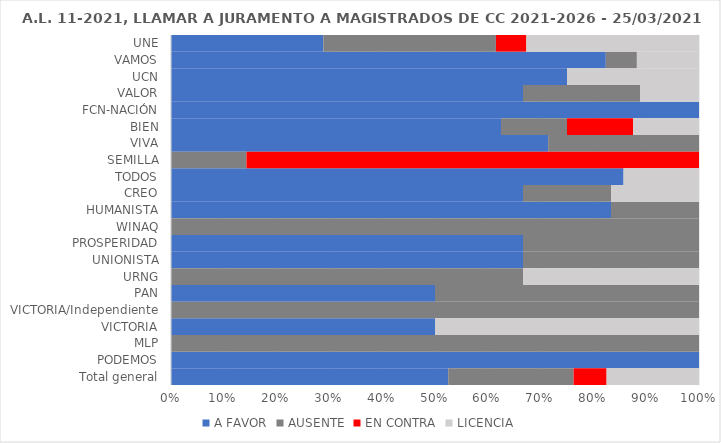
| Category | A FAVOR | AUSENTE | EN CONTRA | LICENCIA |
|---|---|---|---|---|
| UNE | 0.288 | 0.327 | 0.058 | 0.327 |
| VAMOS | 0.824 | 0.059 | 0 | 0.118 |
| UCN | 0.75 | 0 | 0 | 0.25 |
| VALOR | 0.667 | 0.222 | 0 | 0.111 |
| FCN-NACIÓN | 1 | 0 | 0 | 0 |
| BIEN | 0.625 | 0.125 | 0.125 | 0.125 |
| VIVA | 0.714 | 0.286 | 0 | 0 |
| SEMILLA | 0 | 0.143 | 0.857 | 0 |
| TODOS | 0.857 | 0 | 0 | 0.143 |
| CREO | 0.667 | 0.167 | 0 | 0.167 |
| HUMANISTA | 0.833 | 0.167 | 0 | 0 |
| WINAQ | 0 | 1 | 0 | 0 |
| PROSPERIDAD | 0.667 | 0.333 | 0 | 0 |
| UNIONISTA | 0.667 | 0.333 | 0 | 0 |
| URNG | 0 | 0.667 | 0 | 0.333 |
| PAN | 0.5 | 0.5 | 0 | 0 |
| VICTORIA/Independiente | 0 | 1 | 0 | 0 |
| VICTORIA | 0.5 | 0 | 0 | 0.5 |
| MLP | 0 | 1 | 0 | 0 |
| PODEMOS | 1 | 0 | 0 | 0 |
| Total general | 0.525 | 0.238 | 0.062 | 0.175 |